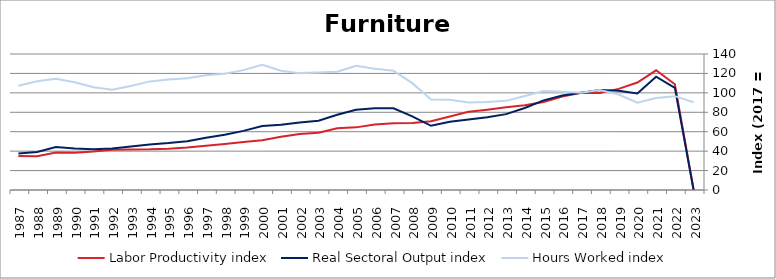
| Category | Labor Productivity index | Real Sectoral Output index | Hours Worked index |
|---|---|---|---|
| 2023.0 | 0 | 0 | 90.266 |
| 2022.0 | 108.829 | 105.12 | 96.592 |
| 2021.0 | 123.226 | 116.638 | 94.654 |
| 2020.0 | 110.587 | 99.286 | 89.781 |
| 2019.0 | 104.086 | 102.285 | 98.27 |
| 2018.0 | 99.979 | 102.91 | 102.931 |
| 2017.0 | 100 | 100 | 100 |
| 2016.0 | 96.272 | 97.313 | 101.081 |
| 2015.0 | 90.576 | 92.229 | 101.825 |
| 2014.0 | 87.32 | 84.464 | 96.729 |
| 2013.0 | 85.119 | 78.1 | 91.754 |
| 2012.0 | 82.712 | 74.927 | 90.588 |
| 2011.0 | 80.563 | 72.48 | 89.967 |
| 2010.0 | 75.678 | 70.226 | 92.796 |
| 2009.0 | 70.867 | 66.1 | 93.274 |
| 2008.0 | 68.9 | 75.806 | 110.023 |
| 2007.0 | 68.602 | 84.168 | 122.69 |
| 2006.0 | 67.491 | 84.192 | 124.746 |
| 2005.0 | 64.474 | 82.495 | 127.95 |
| 2004.0 | 63.65 | 77.479 | 121.727 |
| 2003.0 | 58.939 | 71.26 | 120.905 |
| 2002.0 | 57.727 | 69.453 | 120.314 |
| 2001.0 | 54.745 | 67.17 | 122.695 |
| 2000.0 | 51.173 | 65.948 | 128.873 |
| 1999.0 | 49.335 | 60.878 | 123.399 |
| 1998.0 | 47.46 | 56.783 | 119.643 |
| 1997.0 | 45.561 | 53.787 | 118.056 |
| 1996.0 | 43.672 | 50.258 | 115.079 |
| 1995.0 | 42.424 | 48.275 | 113.792 |
| 1994.0 | 41.889 | 46.836 | 111.81 |
| 1993.0 | 41.799 | 44.778 | 107.128 |
| 1992.0 | 41.459 | 42.799 | 103.232 |
| 1991.0 | 39.677 | 42.008 | 105.874 |
| 1990.0 | 38.47 | 42.681 | 110.947 |
| 1989.0 | 38.533 | 44.137 | 114.543 |
| 1988.0 | 34.836 | 39.026 | 112.029 |
| 1987.0 | 35.122 | 37.693 | 107.32 |